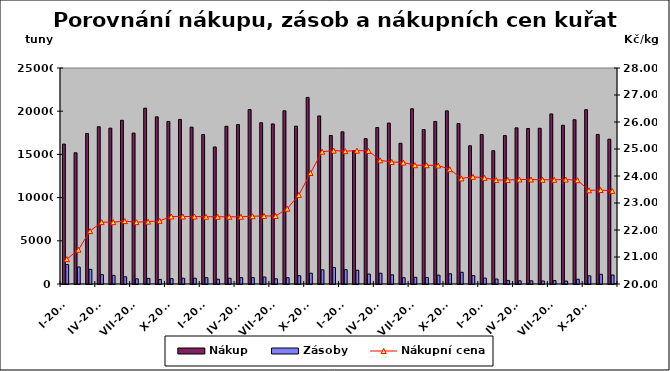
| Category | Nákup | Zásoby |
|---|---|---|
| I-2011 | 16193 | 2251 |
| II-2011 | 15184 | 1971 |
| III-2011 | 17422 | 1697 |
| IV-2011 | 18199 | 1077 |
| V-2011 | 18038 | 996 |
| VI-2011 | 18948 | 837 |
| VII-2011 | 17467 | 601 |
| VIII-2011 | 20347 | 646 |
| IX-2011 | 19346 | 527 |
| X-2011 | 18814 | 626 |
| XI-2011 | 19048 | 665 |
| XII-2011 | 18154 | 671 |
| I-2012 | 17302 | 730 |
| II-2012 | 15861 | 550 |
| III-2012 | 18251 | 666 |
| IV-2012 | 18456 | 736 |
| V-2012 | 20189 | 743 |
| VI-2012 | 18665 | 809 |
| VII-2012 | 18525 | 597 |
| VIII-2012 | 20045 | 729 |
| IX-2012 | 18261 | 965 |
| X-2012 | 21598 | 1253 |
| XI-2012 | 19450 | 1639 |
| XII-2012 | 17192 | 1911 |
| I-2013 | 17609 | 1667 |
| II-2013 | 15430 | 1596 |
| III-2013 | 16826 | 1152 |
| IV-2013 | 18109 | 1246 |
| V-2013 | 18625 | 1065 |
| VI-2013 | 16288 | 728 |
| VII-2013 | 20278 | 776 |
| VIII-2013 | 17879 | 756 |
| IX-2013 | 18814 | 1025 |
| X-2013 | 20041 | 1182 |
| XI-2013 | 18570 | 1356 |
| XII-2013 | 15995 | 983 |
| I-2014 | 17305 | 684 |
| II-2014 | 15427 | 574 |
| III-2014 | 17182 | 412 |
| IV-2014 | 18073 | 368 |
| V-2014 | 18000 | 366 |
| VI-2014 | 18025 | 348 |
| VII-2014 | 19683 | 392 |
| VIII-2014 | 18372 | 337 |
| IX-2014 | 19012 | 552 |
| X-2014 | 20168 | 945 |
| XI-2014 | 17311 | 1122 |
| XII-2014 | 16758 | 1041 |